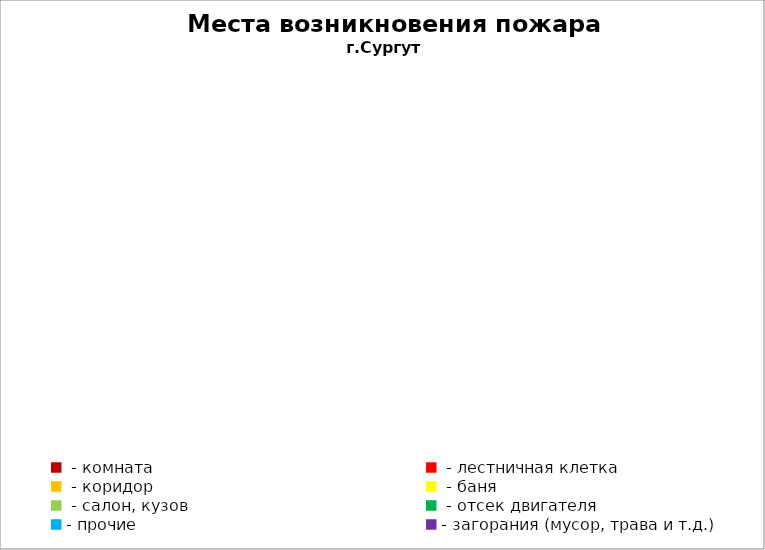
| Category | Места возникновения пожара |
|---|---|
|  - комната | 47 |
|  - лестничная клетка | 22 |
|  - коридор | 3 |
|  - баня | 30 |
|  - салон, кузов | 19 |
|  - отсек двигателя | 25 |
| - прочие | 77 |
| - загорания (мусор, трава и т.д.)  | 154 |